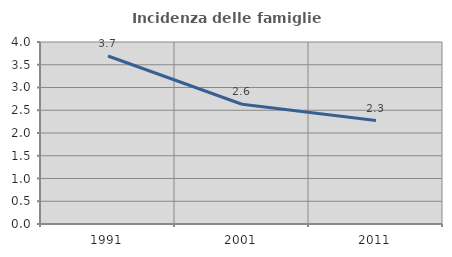
| Category | Incidenza delle famiglie numerose |
|---|---|
| 1991.0 | 3.692 |
| 2001.0 | 2.632 |
| 2011.0 | 2.273 |